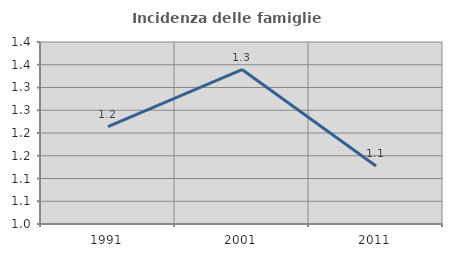
| Category | Incidenza delle famiglie numerose |
|---|---|
| 1991.0 | 1.214 |
| 2001.0 | 1.34 |
| 2011.0 | 1.127 |